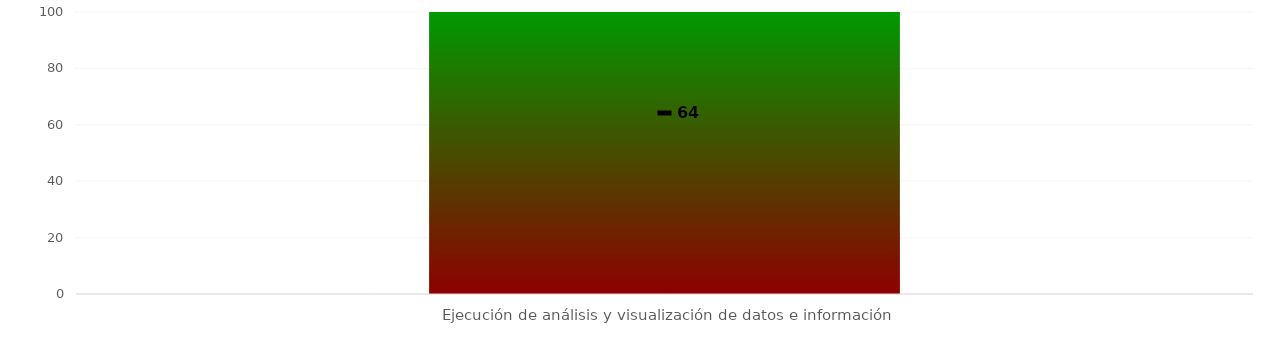
| Category | Niveles |
|---|---|
| Ejecución de análisis y visualización de datos e información | 100 |